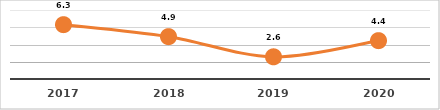
| Category | COBERTURA DE BECADOS EXTERNOS (%)
PRIMER SEMESTRE, EJERCICIO 2020 |
|---|---|
| 2017.0 | 6.3 |
| 2018.0 | 4.91 |
| 2019.0 | 2.573 |
| 2020.0 | 4.447 |